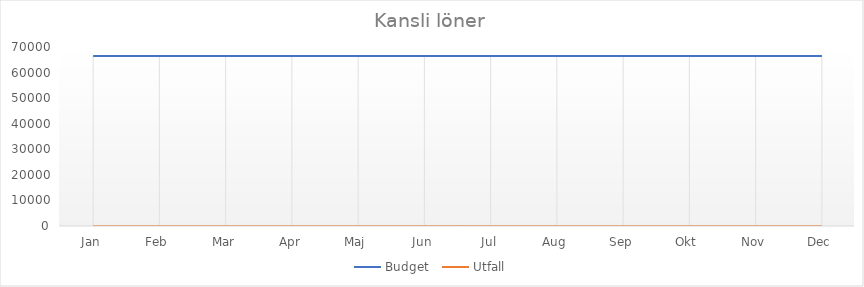
| Category | Budget  | Utfall |
|---|---|---|
| Jan | 66500 | 0 |
| Feb | 66500 | 0 |
| Mar | 66500 | 0 |
| Apr | 66500 | 0 |
| Maj | 66500 | 0 |
| Jun | 66500 | 0 |
| Jul | 66500 | 0 |
| Aug | 66500 | 0 |
| Sep | 66500 | 0 |
| Okt | 66500 | 0 |
| Nov | 66500 | 0 |
| Dec | 66500 | 0 |